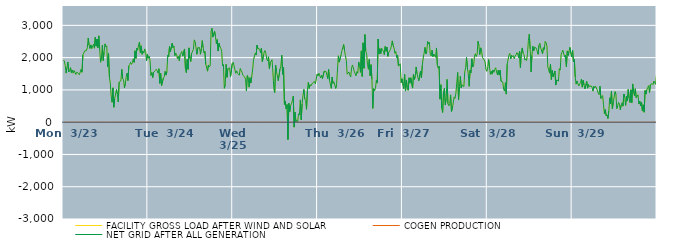
| Category | FACILITY GROSS LOAD AFTER WIND AND SOLAR | COGEN PRODUCTION | NET GRID AFTER ALL GENERATION |
|---|---|---|---|
|  Mon  3/23 | 1926 | 0 | 1926 |
|  Mon  3/23 | 1894 | 0 | 1894 |
|  Mon  3/23 | 1758 | 0 | 1758 |
|  Mon  3/23 | 1520 | 0 | 1520 |
|  Mon  3/23 | 1694 | 0 | 1694 |
|  Mon  3/23 | 1864 | 0 | 1864 |
|  Mon  3/23 | 1554 | 0 | 1554 |
|  Mon  3/23 | 1595 | 0 | 1595 |
|  Mon  3/23 | 1689 | 0 | 1689 |
|  Mon  3/23 | 1537 | 0 | 1537 |
|  Mon  3/23 | 1616 | 0 | 1616 |
|  Mon  3/23 | 1517 | 0 | 1517 |
|  Mon  3/23 | 1602 | 0 | 1602 |
|  Mon  3/23 | 1546 | 0 | 1546 |
|  Mon  3/23 | 1478 | 0 | 1478 |
|  Mon  3/23 | 1548 | 0 | 1548 |
|  Mon  3/23 | 1570 | 0 | 1570 |
|  Mon  3/23 | 1511 | 0 | 1511 |
|  Mon  3/23 | 1467 | 0 | 1467 |
|  Mon  3/23 | 1456 | 0 | 1456 |
|  Mon  3/23 | 1640 | 0 | 1640 |
|  Mon  3/23 | 1547 | 0 | 1547 |
|  Mon  3/23 | 2085 | 0 | 2085 |
|  Mon  3/23 | 2141 | 0 | 2141 |
|  Mon  3/23 | 2209 | 0 | 2209 |
|  Mon  3/23 | 2197 | 0 | 2197 |
|  Mon  3/23 | 2219 | 0 | 2219 |
|  Mon  3/23 | 2303 | 0 | 2303 |
|  Mon  3/23 | 2605 | 0 | 2605 |
|  Mon  3/23 | 2391 | 0 | 2391 |
|  Mon  3/23 | 2285 | 0 | 2285 |
|  Mon  3/23 | 2394 | 0 | 2394 |
|  Mon  3/23 | 2282 | 0 | 2282 |
|  Mon  3/23 | 2275 | 0 | 2275 |
|  Mon  3/23 | 2415 | 0 | 2415 |
|  Mon  3/23 | 2292 | 0 | 2292 |
|  Mon  3/23 | 2630 | 0 | 2630 |
|  Mon  3/23 | 2355 | 0 | 2355 |
|  Mon  3/23 | 2577 | 0 | 2577 |
|  Mon  3/23 | 2306 | 0 | 2306 |
|  Mon  3/23 | 2674 | 0 | 2674 |
|  Mon  3/23 | 2248 | 0 | 2248 |
|  Mon  3/23 | 1858 | 0 | 1858 |
|  Mon  3/23 | 1997 | 0 | 1997 |
|  Mon  3/23 | 2381 | 0 | 2381 |
|  Mon  3/23 | 1911 | 0 | 1911 |
|  Mon  3/23 | 2185 | 0 | 2185 |
|  Mon  3/23 | 2426 | 0 | 2426 |
|  Mon  3/23 | 2334 | 0 | 2334 |
|  Mon  3/23 | 2366 | 0 | 2366 |
|  Mon  3/23 | 1715 | 0 | 1715 |
|  Mon  3/23 | 2128 | 0 | 2128 |
|  Mon  3/23 | 1397 | 0 | 1397 |
|  Mon  3/23 | 1209 | 0 | 1209 |
|  Mon  3/23 | 812 | 0 | 812 |
|  Mon  3/23 | 617 | 0 | 617 |
|  Mon  3/23 | 1064 | 0 | 1064 |
|  Mon  3/23 | 462 | 0 | 462 |
|  Mon  3/23 | 733 | 0 | 733 |
|  Mon  3/23 | 871 | 0 | 871 |
|  Mon  3/23 | 1016 | 0 | 1016 |
|  Mon  3/23 | 862 | 0 | 862 |
|  Mon  3/23 | 625 | 0 | 625 |
|  Mon  3/23 | 1240 | 0 | 1240 |
|  Mon  3/23 | 1255 | 0 | 1255 |
|  Mon  3/23 | 1280 | 0 | 1280 |
|  Mon  3/23 | 1640 | 0 | 1640 |
|  Mon  3/23 | 1347 | 0 | 1347 |
|  Mon  3/23 | 1316 | 0 | 1316 |
|  Mon  3/23 | 1067 | 0 | 1067 |
|  Mon  3/23 | 1188 | 0 | 1188 |
|  Mon  3/23 | 1402 | 0 | 1402 |
|  Mon  3/23 | 1521 | 0 | 1521 |
|  Mon  3/23 | 1289 | 0 | 1289 |
|  Mon  3/23 | 1749 | 0 | 1749 |
|  Mon  3/23 | 1790 | 0 | 1790 |
|  Mon  3/23 | 1855 | 0 | 1855 |
|  Mon  3/23 | 1791 | 0 | 1791 |
|  Mon  3/23 | 1844 | 0 | 1844 |
|  Mon  3/23 | 1961 | 0 | 1961 |
|  Mon  3/23 | 1854 | 0 | 1854 |
|  Mon  3/23 | 2213 | 0 | 2213 |
|  Mon  3/23 | 1976 | 0 | 1976 |
|  Mon  3/23 | 2293 | 0 | 2293 |
|  Mon  3/23 | 2232 | 0 | 2232 |
|  Mon  3/23 | 2400 | 0 | 2400 |
|  Mon  3/23 | 2485 | 0 | 2485 |
|  Mon  3/23 | 2157 | 0 | 2157 |
|  Mon  3/23 | 2365 | 0 | 2365 |
|  Mon  3/23 | 2103 | 0 | 2103 |
|  Mon  3/23 | 2202 | 0 | 2202 |
|  Mon  3/23 | 2140 | 0 | 2140 |
|  Mon  3/23 | 2270 | 0 | 2270 |
|  Mon  3/23 | 2191 | 0 | 2191 |
|  Mon  3/23 | 1902 | 0 | 1902 |
|  Mon  3/23 | 2113 | 0 | 2113 |
|  Tue  3/24 | 1983 | 0 | 1983 |
|  Tue  3/24 | 2049 | 0 | 2049 |
|  Tue  3/24 | 1904 | 0 | 1904 |
|  Tue  3/24 | 1450 | 0 | 1450 |
|  Tue  3/24 | 1537 | 0 | 1537 |
|  Tue  3/24 | 1384 | 0 | 1384 |
|  Tue  3/24 | 1547 | 0 | 1547 |
|  Tue  3/24 | 1558 | 0 | 1558 |
|  Tue  3/24 | 1601 | 0 | 1601 |
|  Tue  3/24 | 1641 | 0 | 1641 |
|  Tue  3/24 | 1593 | 0 | 1593 |
|  Tue  3/24 | 1521 | 0 | 1521 |
|  Tue  3/24 | 1658 | 0 | 1658 |
|  Tue  3/24 | 1202 | 0 | 1202 |
|  Tue  3/24 | 1512 | 0 | 1512 |
|  Tue  3/24 | 1131 | 0 | 1131 |
|  Tue  3/24 | 1153 | 0 | 1153 |
|  Tue  3/24 | 1360 | 0 | 1360 |
|  Tue  3/24 | 1405 | 0 | 1405 |
|  Tue  3/24 | 1576 | 0 | 1576 |
|  Tue  3/24 | 1459 | 0 | 1459 |
|  Tue  3/24 | 1564 | 0 | 1564 |
|  Tue  3/24 | 2078 | 0 | 2078 |
|  Tue  3/24 | 2019 | 0 | 2019 |
|  Tue  3/24 | 2344 | 0 | 2344 |
|  Tue  3/24 | 2187 | 0 | 2187 |
|  Tue  3/24 | 2198 | 0 | 2198 |
|  Tue  3/24 | 2444 | 0 | 2444 |
|  Tue  3/24 | 2306 | 0 | 2306 |
|  Tue  3/24 | 2363 | 0 | 2363 |
|  Tue  3/24 | 2059 | 0 | 2059 |
|  Tue  3/24 | 2145 | 0 | 2145 |
|  Tue  3/24 | 2091 | 0 | 2091 |
|  Tue  3/24 | 1969 | 0 | 1969 |
|  Tue  3/24 | 2043 | 0 | 2043 |
|  Tue  3/24 | 1905 | 0 | 1905 |
|  Tue  3/24 | 2091 | 0 | 2091 |
|  Tue  3/24 | 2108 | 0 | 2108 |
|  Tue  3/24 | 2190 | 0 | 2190 |
|  Tue  3/24 | 2046 | 0 | 2046 |
|  Tue  3/24 | 2020 | 0 | 2020 |
|  Tue  3/24 | 2269 | 0 | 2269 |
|  Tue  3/24 | 1661 | 0 | 1661 |
|  Tue  3/24 | 1533 | 0 | 1533 |
|  Tue  3/24 | 1947 | 0 | 1947 |
|  Tue  3/24 | 1635 | 0 | 1635 |
|  Tue  3/24 | 2303 | 0 | 2303 |
|  Tue  3/24 | 1984 | 0 | 1984 |
|  Tue  3/24 | 1877 | 0 | 1877 |
|  Tue  3/24 | 2133 | 0 | 2133 |
|  Tue  3/24 | 2107 | 0 | 2107 |
|  Tue  3/24 | 2254 | 0 | 2254 |
|  Tue  3/24 | 2552 | 0 | 2552 |
|  Tue  3/24 | 2497 | 0 | 2497 |
|  Tue  3/24 | 2500 | 0 | 2500 |
|  Tue  3/24 | 2103 | 0 | 2103 |
|  Tue  3/24 | 2306 | 0 | 2306 |
|  Tue  3/24 | 2335 | 0 | 2335 |
|  Tue  3/24 | 2311 | 0 | 2311 |
|  Tue  3/24 | 2106 | 0 | 2106 |
|  Tue  3/24 | 2274 | 0 | 2274 |
|  Tue  3/24 | 2528 | 0 | 2528 |
|  Tue  3/24 | 2315 | 0 | 2315 |
|  Tue  3/24 | 2142 | 0 | 2142 |
|  Tue  3/24 | 2198 | 0 | 2198 |
|  Tue  3/24 | 1800 | 0 | 1800 |
|  Tue  3/24 | 1792 | 0 | 1792 |
|  Tue  3/24 | 1581 | 0 | 1581 |
|  Tue  3/24 | 1773 | 0 | 1773 |
|  Tue  3/24 | 1712 | 0 | 1712 |
|  Tue  3/24 | 1748 | 0 | 1748 |
|  Tue  3/24 | 2812 | 0 | 2812 |
|  Tue  3/24 | 2909 | 0 | 2909 |
|  Tue  3/24 | 2637 | 0 | 2637 |
|  Tue  3/24 | 2607 | 0 | 2607 |
|  Tue  3/24 | 2814 | 0 | 2814 |
|  Tue  3/24 | 2661 | 0 | 2661 |
|  Tue  3/24 | 2428 | 0 | 2428 |
|  Tue  3/24 | 2560 | 0 | 2560 |
|  Tue  3/24 | 2205 | 0 | 2205 |
|  Tue  3/24 | 2447 | 0 | 2447 |
|  Tue  3/24 | 2333 | 0 | 2333 |
|  Tue  3/24 | 2295 | 0 | 2295 |
|  Tue  3/24 | 2197 | 0 | 2197 |
|  Tue  3/24 | 1740 | 0 | 1740 |
|  Tue  3/24 | 1786 | 0 | 1786 |
|  Tue  3/24 | 1049 | 0 | 1049 |
|  Tue  3/24 | 1154 | 0 | 1154 |
|  Tue  3/24 | 1792 | 0 | 1792 |
|  Tue  3/24 | 1389 | 0 | 1389 |
|  Tue  3/24 | 1658 | 0 | 1658 |
|  Tue  3/24 | 1678 | 0 | 1678 |
|  Tue  3/24 | 1682 | 0 | 1682 |
|  Tue  3/24 | 1411 | 0 | 1411 |
|  Tue  3/24 | 1417 | 0 | 1417 |
|  Tue  3/24 | 1816 | 0 | 1816 |
|  Wed  3/25 | 1859 | 0 | 1859 |
|  Wed  3/25 | 1746 | 0 | 1746 |
|  Wed  3/25 | 1622 | 0 | 1622 |
|  Wed  3/25 | 1515 | 0 | 1515 |
|  Wed  3/25 | 1591 | 0 | 1591 |
|  Wed  3/25 | 1509 | 0 | 1509 |
|  Wed  3/25 | 1496 | 0 | 1496 |
|  Wed  3/25 | 1457 | 0 | 1457 |
|  Wed  3/25 | 1667 | 0 | 1667 |
|  Wed  3/25 | 1605 | 0 | 1605 |
|  Wed  3/25 | 1554 | 0 | 1554 |
|  Wed  3/25 | 1452 | 0 | 1452 |
|  Wed  3/25 | 1454 | 0 | 1454 |
|  Wed  3/25 | 1403 | 0 | 1403 |
|  Wed  3/25 | 1333 | 0 | 1333 |
|  Wed  3/25 | 973 | 0 | 973 |
|  Wed  3/25 | 1446 | 0 | 1446 |
|  Wed  3/25 | 1394 | 0 | 1394 |
|  Wed  3/25 | 1085 | 0 | 1085 |
|  Wed  3/25 | 1378 | 0 | 1378 |
|  Wed  3/25 | 1212 | 0 | 1212 |
|  Wed  3/25 | 1412 | 0 | 1412 |
|  Wed  3/25 | 1618 | 0 | 1618 |
|  Wed  3/25 | 1925 | 0 | 1925 |
|  Wed  3/25 | 1928 | 0 | 1928 |
|  Wed  3/25 | 2142 | 0 | 2142 |
|  Wed  3/25 | 2079 | 0 | 2079 |
|  Wed  3/25 | 2390 | 0 | 2390 |
|  Wed  3/25 | 2282 | 0 | 2282 |
|  Wed  3/25 | 2289 | 0 | 2289 |
|  Wed  3/25 | 2264 | 0 | 2264 |
|  Wed  3/25 | 2155 | 0 | 2155 |
|  Wed  3/25 | 2290 | 0 | 2290 |
|  Wed  3/25 | 1878 | 0 | 1878 |
|  Wed  3/25 | 1998 | 0 | 1998 |
|  Wed  3/25 | 2167 | 0 | 2167 |
|  Wed  3/25 | 2221 | 0 | 2221 |
|  Wed  3/25 | 2135 | 0 | 2135 |
|  Wed  3/25 | 1950 | 0 | 1950 |
|  Wed  3/25 | 1899 | 0 | 1899 |
|  Wed  3/25 | 2027 | 0 | 2027 |
|  Wed  3/25 | 1661 | 0 | 1661 |
|  Wed  3/25 | 1851 | 0 | 1851 |
|  Wed  3/25 | 1873 | 0 | 1873 |
|  Wed  3/25 | 1935 | 0 | 1935 |
|  Wed  3/25 | 1534 | 0 | 1534 |
|  Wed  3/25 | 1056 | 0 | 1056 |
|  Wed  3/25 | 916 | 0 | 916 |
|  Wed  3/25 | 1770 | 0 | 1770 |
|  Wed  3/25 | 1571 | 0 | 1571 |
|  Wed  3/25 | 1559 | 0 | 1559 |
|  Wed  3/25 | 1284 | 0 | 1284 |
|  Wed  3/25 | 1256 | 0 | 1256 |
|  Wed  3/25 | 1649 | 0 | 1649 |
|  Wed  3/25 | 1734 | 0 | 1734 |
|  Wed  3/25 | 2079 | 0 | 2079 |
|  Wed  3/25 | 1484 | 0 | 1484 |
|  Wed  3/25 | 1695 | 0 | 1695 |
|  Wed  3/25 | 550 | 0 | 550 |
|  Wed  3/25 | 658 | 0 | 658 |
|  Wed  3/25 | 408 | 0 | 408 |
|  Wed  3/25 | 545 | 0 | 545 |
|  Wed  3/25 | -540 | 0 | -540 |
|  Wed  3/25 | 589 | 0 | 589 |
|  Wed  3/25 | 324 | 0 | 324 |
|  Wed  3/25 | 513 | 0 | 513 |
|  Wed  3/25 | 577 | 0 | 577 |
|  Wed  3/25 | 670 | 0 | 670 |
|  Wed  3/25 | 808 | 0 | 808 |
|  Wed  3/25 | -154 | 0 | -154 |
|  Wed  3/25 | 308 | 0 | 308 |
|  Wed  3/25 | 18 | 0 | 18 |
|  Wed  3/25 | 58 | 0 | 58 |
|  Wed  3/25 | 21 | 0 | 21 |
|  Wed  3/25 | 260 | 0 | 260 |
|  Wed  3/25 | 225 | 0 | 225 |
|  Wed  3/25 | 691 | 0 | 691 |
|  Wed  3/25 | 74 | 0 | 74 |
|  Wed  3/25 | 565 | 0 | 565 |
|  Wed  3/25 | 830 | 0 | 830 |
|  Wed  3/25 | 1014 | 0 | 1014 |
|  Wed  3/25 | 718 | 0 | 718 |
|  Wed  3/25 | 676 | 0 | 676 |
|  Wed  3/25 | 399 | 0 | 399 |
|  Wed  3/25 | 968 | 0 | 968 |
|  Wed  3/25 | 1234 | 0 | 1234 |
|  Wed  3/25 | 1045 | 0 | 1045 |
|  Wed  3/25 | 1161 | 0 | 1161 |
|  Wed  3/25 | 1126 | 0 | 1126 |
|  Wed  3/25 | 1181 | 0 | 1181 |
|  Wed  3/25 | 1220 | 0 | 1220 |
|  Wed  3/25 | 1199 | 0 | 1199 |
|  Wed  3/25 | 1260 | 0 | 1260 |
|  Wed  3/25 | 1188 | 0 | 1188 |
|  Wed  3/25 | 1173 | 0 | 1173 |
|  Wed  3/25 | 1494 | 0 | 1494 |
|  Thu  3/26 | 1430 | 0 | 1430 |
|  Thu  3/26 | 1518 | 0 | 1518 |
|  Thu  3/26 | 1511 | 0 | 1511 |
|  Thu  3/26 | 1369 | 0 | 1369 |
|  Thu  3/26 | 1455 | 0 | 1455 |
|  Thu  3/26 | 1348 | 0 | 1348 |
|  Thu  3/26 | 1365 | 0 | 1365 |
|  Thu  3/26 | 1580 | 0 | 1580 |
|  Thu  3/26 | 1592 | 0 | 1592 |
|  Thu  3/26 | 1571 | 0 | 1571 |
|  Thu  3/26 | 1585 | 0 | 1585 |
|  Thu  3/26 | 1349 | 0 | 1349 |
|  Thu  3/26 | 1634 | 0 | 1634 |
|  Thu  3/26 | 1294 | 0 | 1294 |
|  Thu  3/26 | 1319 | 0 | 1319 |
|  Thu  3/26 | 1049 | 0 | 1049 |
|  Thu  3/26 | 1399 | 0 | 1399 |
|  Thu  3/26 | 1202 | 0 | 1202 |
|  Thu  3/26 | 1250 | 0 | 1250 |
|  Thu  3/26 | 1246 | 0 | 1246 |
|  Thu  3/26 | 1048 | 0 | 1048 |
|  Thu  3/26 | 1163 | 0 | 1163 |
|  Thu  3/26 | 1617 | 0 | 1617 |
|  Thu  3/26 | 2056 | 0 | 2056 |
|  Thu  3/26 | 1860 | 0 | 1860 |
|  Thu  3/26 | 1886 | 0 | 1886 |
|  Thu  3/26 | 2076 | 0 | 2076 |
|  Thu  3/26 | 2214 | 0 | 2214 |
|  Thu  3/26 | 2244 | 0 | 2244 |
|  Thu  3/26 | 2406 | 0 | 2406 |
|  Thu  3/26 | 2218 | 0 | 2218 |
|  Thu  3/26 | 2064 | 0 | 2064 |
|  Thu  3/26 | 1915 | 0 | 1915 |
|  Thu  3/26 | 1488 | 0 | 1488 |
|  Thu  3/26 | 1483 | 0 | 1483 |
|  Thu  3/26 | 1555 | 0 | 1555 |
|  Thu  3/26 | 1460 | 0 | 1460 |
|  Thu  3/26 | 1401 | 0 | 1401 |
|  Thu  3/26 | 1691 | 0 | 1691 |
|  Thu  3/26 | 1773 | 0 | 1773 |
|  Thu  3/26 | 1769 | 0 | 1769 |
|  Thu  3/26 | 1578 | 0 | 1578 |
|  Thu  3/26 | 1604 | 0 | 1604 |
|  Thu  3/26 | 1436 | 0 | 1436 |
|  Thu  3/26 | 1569 | 0 | 1569 |
|  Thu  3/26 | 1517 | 0 | 1517 |
|  Thu  3/26 | 1866 | 0 | 1866 |
|  Thu  3/26 | 1751 | 0 | 1751 |
|  Thu  3/26 | 1545 | 0 | 1545 |
|  Thu  3/26 | 2210 | 0 | 2210 |
|  Thu  3/26 | 1417 | 0 | 1417 |
|  Thu  3/26 | 2459 | 0 | 2459 |
|  Thu  3/26 | 1669 | 0 | 1669 |
|  Thu  3/26 | 2716 | 0 | 2716 |
|  Thu  3/26 | 2204 | 0 | 2204 |
|  Thu  3/26 | 2107 | 0 | 2107 |
|  Thu  3/26 | 1784 | 0 | 1784 |
|  Thu  3/26 | 1640 | 0 | 1640 |
|  Thu  3/26 | 1945 | 0 | 1945 |
|  Thu  3/26 | 1439 | 0 | 1439 |
|  Thu  3/26 | 1782 | 0 | 1782 |
|  Thu  3/26 | 1324 | 0 | 1324 |
|  Thu  3/26 | 427 | 0 | 427 |
|  Thu  3/26 | 1039 | 0 | 1039 |
|  Thu  3/26 | 983 | 0 | 983 |
|  Thu  3/26 | 1045 | 0 | 1045 |
|  Thu  3/26 | 1308 | 0 | 1308 |
|  Thu  3/26 | 1211 | 0 | 1211 |
|  Thu  3/26 | 2577 | 0 | 2577 |
|  Thu  3/26 | 2112 | 0 | 2112 |
|  Thu  3/26 | 2279 | 0 | 2279 |
|  Thu  3/26 | 2124 | 0 | 2124 |
|  Thu  3/26 | 2285 | 0 | 2285 |
|  Thu  3/26 | 2238 | 0 | 2238 |
|  Thu  3/26 | 2202 | 0 | 2202 |
|  Thu  3/26 | 2091 | 0 | 2091 |
|  Thu  3/26 | 2346 | 0 | 2346 |
|  Thu  3/26 | 2197 | 0 | 2197 |
|  Thu  3/26 | 2325 | 0 | 2325 |
|  Thu  3/26 | 2040 | 0 | 2040 |
|  Thu  3/26 | 2167 | 0 | 2167 |
|  Thu  3/26 | 2195 | 0 | 2195 |
|  Thu  3/26 | 2249 | 0 | 2249 |
|  Thu  3/26 | 2367 | 0 | 2367 |
|  Thu  3/26 | 2520 | 0 | 2520 |
|  Thu  3/26 | 2374 | 0 | 2374 |
|  Thu  3/26 | 2297 | 0 | 2297 |
|  Thu  3/26 | 2133 | 0 | 2133 |
|  Thu  3/26 | 2191 | 0 | 2191 |
|  Thu  3/26 | 2006 | 0 | 2006 |
|  Thu  3/26 | 2079 | 0 | 2079 |
|  Thu  3/26 | 1738 | 0 | 1738 |
|  Thu  3/26 | 1733 | 0 | 1733 |
|  Thu  3/26 | 1810 | 0 | 1810 |
|  Thu  3/26 | 1224 | 0 | 1224 |
|  Thu  3/26 | 1345 | 0 | 1345 |
|  Fri  3/27 | 1323 | 0 | 1323 |
|  Fri  3/27 | 1045 | 0 | 1045 |
|  Fri  3/27 | 1479 | 0 | 1479 |
|  Fri  3/27 | 964 | 0 | 964 |
|  Fri  3/27 | 1308 | 0 | 1308 |
|  Fri  3/27 | 1066 | 0 | 1066 |
|  Fri  3/27 | 989 | 0 | 989 |
|  Fri  3/27 | 1375 | 0 | 1375 |
|  Fri  3/27 | 1209 | 0 | 1209 |
|  Fri  3/27 | 1376 | 0 | 1376 |
|  Fri  3/27 | 1394 | 0 | 1394 |
|  Fri  3/27 | 1056 | 0 | 1056 |
|  Fri  3/27 | 1489 | 0 | 1489 |
|  Fri  3/27 | 1325 | 0 | 1325 |
|  Fri  3/27 | 1408 | 0 | 1408 |
|  Fri  3/27 | 1712 | 0 | 1712 |
|  Fri  3/27 | 1501 | 0 | 1501 |
|  Fri  3/27 | 1502 | 0 | 1502 |
|  Fri  3/27 | 1283 | 0 | 1283 |
|  Fri  3/27 | 1303 | 0 | 1303 |
|  Fri  3/27 | 1583 | 0 | 1583 |
|  Fri  3/27 | 1371 | 0 | 1371 |
|  Fri  3/27 | 1763 | 0 | 1763 |
|  Fri  3/27 | 1990 | 0 | 1990 |
|  Fri  3/27 | 2136 | 0 | 2136 |
|  Fri  3/27 | 2318 | 0 | 2318 |
|  Fri  3/27 | 2117 | 0 | 2117 |
|  Fri  3/27 | 2194 | 0 | 2194 |
|  Fri  3/27 | 2500 | 0 | 2500 |
|  Fri  3/27 | 2420 | 0 | 2420 |
|  Fri  3/27 | 2475 | 0 | 2475 |
|  Fri  3/27 | 2102 | 0 | 2102 |
|  Fri  3/27 | 2052 | 0 | 2052 |
|  Fri  3/27 | 2231 | 0 | 2231 |
|  Fri  3/27 | 2033 | 0 | 2033 |
|  Fri  3/27 | 2111 | 0 | 2111 |
|  Fri  3/27 | 2083 | 0 | 2083 |
|  Fri  3/27 | 2011 | 0 | 2011 |
|  Fri  3/27 | 2300 | 0 | 2300 |
|  Fri  3/27 | 1763 | 0 | 1763 |
|  Fri  3/27 | 1668 | 0 | 1668 |
|  Fri  3/27 | 1737 | 0 | 1737 |
|  Fri  3/27 | 713 | 0 | 713 |
|  Fri  3/27 | 1159 | 0 | 1159 |
|  Fri  3/27 | 429 | 0 | 429 |
|  Fri  3/27 | 300 | 0 | 300 |
|  Fri  3/27 | 936 | 0 | 936 |
|  Fri  3/27 | 1053 | 0 | 1053 |
|  Fri  3/27 | 535 | 0 | 535 |
|  Fri  3/27 | 732 | 0 | 732 |
|  Fri  3/27 | 1325 | 0 | 1325 |
|  Fri  3/27 | 572 | 0 | 572 |
|  Fri  3/27 | 508 | 0 | 508 |
|  Fri  3/27 | 572 | 0 | 572 |
|  Fri  3/27 | 846 | 0 | 846 |
|  Fri  3/27 | 331 | 0 | 331 |
|  Fri  3/27 | 423 | 0 | 423 |
|  Fri  3/27 | 395 | 0 | 395 |
|  Fri  3/27 | 783 | 0 | 783 |
|  Fri  3/27 | 737 | 0 | 737 |
|  Fri  3/27 | 903 | 0 | 903 |
|  Fri  3/27 | 1214 | 0 | 1214 |
|  Fri  3/27 | 1541 | 0 | 1541 |
|  Fri  3/27 | 686 | 0 | 686 |
|  Fri  3/27 | 1104 | 0 | 1104 |
|  Fri  3/27 | 1421 | 0 | 1421 |
|  Fri  3/27 | 1062 | 0 | 1062 |
|  Fri  3/27 | 1155 | 0 | 1155 |
|  Fri  3/27 | 1176 | 0 | 1176 |
|  Fri  3/27 | 1102 | 0 | 1102 |
|  Fri  3/27 | 1556 | 0 | 1556 |
|  Fri  3/27 | 1686 | 0 | 1686 |
|  Fri  3/27 | 2005 | 0 | 2005 |
|  Fri  3/27 | 1690 | 0 | 1690 |
|  Fri  3/27 | 1497 | 0 | 1497 |
|  Fri  3/27 | 1112 | 0 | 1112 |
|  Fri  3/27 | 1608 | 0 | 1608 |
|  Fri  3/27 | 1529 | 0 | 1529 |
|  Fri  3/27 | 1964 | 0 | 1964 |
|  Fri  3/27 | 1707 | 0 | 1707 |
|  Fri  3/27 | 1741 | 0 | 1741 |
|  Fri  3/27 | 2045 | 0 | 2045 |
|  Fri  3/27 | 2121 | 0 | 2121 |
|  Fri  3/27 | 2033 | 0 | 2033 |
|  Fri  3/27 | 2101 | 0 | 2101 |
|  Fri  3/27 | 2507 | 0 | 2507 |
|  Fri  3/27 | 2381 | 0 | 2381 |
|  Fri  3/27 | 2095 | 0 | 2095 |
|  Fri  3/27 | 2303 | 0 | 2303 |
|  Fri  3/27 | 2221 | 0 | 2221 |
|  Fri  3/27 | 2009 | 0 | 2009 |
|  Fri  3/27 | 2014 | 0 | 2014 |
|  Fri  3/27 | 1931 | 0 | 1931 |
|  Fri  3/27 | 1867 | 0 | 1867 |
|  Fri  3/27 | 1634 | 0 | 1634 |
|  Fri  3/27 | 1577 | 0 | 1577 |
|  Sat  3/28 | 1680 | 0 | 1680 |
|  Sat  3/28 | 1939 | 0 | 1939 |
|  Sat  3/28 | 1718 | 0 | 1718 |
|  Sat  3/28 | 1482 | 0 | 1482 |
|  Sat  3/28 | 1577 | 0 | 1577 |
|  Sat  3/28 | 1487 | 0 | 1487 |
|  Sat  3/28 | 1617 | 0 | 1617 |
|  Sat  3/28 | 1541 | 0 | 1541 |
|  Sat  3/28 | 1638 | 0 | 1638 |
|  Sat  3/28 | 1687 | 0 | 1687 |
|  Sat  3/28 | 1557 | 0 | 1557 |
|  Sat  3/28 | 1467 | 0 | 1467 |
|  Sat  3/28 | 1614 | 0 | 1614 |
|  Sat  3/28 | 1458 | 0 | 1458 |
|  Sat  3/28 | 1611 | 0 | 1611 |
|  Sat  3/28 | 1271 | 0 | 1271 |
|  Sat  3/28 | 1254 | 0 | 1254 |
|  Sat  3/28 | 1245 | 0 | 1245 |
|  Sat  3/28 | 1026 | 0 | 1026 |
|  Sat  3/28 | 965 | 0 | 965 |
|  Sat  3/28 | 1226 | 0 | 1226 |
|  Sat  3/28 | 870 | 0 | 870 |
|  Sat  3/28 | 1797 | 0 | 1797 |
|  Sat  3/28 | 1787 | 0 | 1787 |
|  Sat  3/28 | 2079 | 0 | 2079 |
|  Sat  3/28 | 2132 | 0 | 2132 |
|  Sat  3/28 | 1964 | 0 | 1964 |
|  Sat  3/28 | 2072 | 0 | 2072 |
|  Sat  3/28 | 2026 | 0 | 2026 |
|  Sat  3/28 | 2066 | 0 | 2066 |
|  Sat  3/28 | 1968 | 0 | 1968 |
|  Sat  3/28 | 2047 | 0 | 2047 |
|  Sat  3/28 | 2085 | 0 | 2085 |
|  Sat  3/28 | 2156 | 0 | 2156 |
|  Sat  3/28 | 2109 | 0 | 2109 |
|  Sat  3/28 | 2002 | 0 | 2002 |
|  Sat  3/28 | 2204 | 0 | 2204 |
|  Sat  3/28 | 1679 | 0 | 1679 |
|  Sat  3/28 | 2177 | 0 | 2177 |
|  Sat  3/28 | 2301 | 0 | 2301 |
|  Sat  3/28 | 2136 | 0 | 2136 |
|  Sat  3/28 | 2096 | 0 | 2096 |
|  Sat  3/28 | 1923 | 0 | 1923 |
|  Sat  3/28 | 1962 | 0 | 1962 |
|  Sat  3/28 | 1910 | 0 | 1910 |
|  Sat  3/28 | 2124 | 0 | 2124 |
|  Sat  3/28 | 2529 | 0 | 2529 |
|  Sat  3/28 | 2726 | 0 | 2726 |
|  Sat  3/28 | 2272 | 0 | 2272 |
|  Sat  3/28 | 1558 | 0 | 1558 |
|  Sat  3/28 | 2072 | 0 | 2072 |
|  Sat  3/28 | 2356 | 0 | 2356 |
|  Sat  3/28 | 2209 | 0 | 2209 |
|  Sat  3/28 | 2323 | 0 | 2323 |
|  Sat  3/28 | 2300 | 0 | 2300 |
|  Sat  3/28 | 2291 | 0 | 2291 |
|  Sat  3/28 | 2311 | 0 | 2311 |
|  Sat  3/28 | 2103 | 0 | 2103 |
|  Sat  3/28 | 2380 | 0 | 2380 |
|  Sat  3/28 | 2447 | 0 | 2447 |
|  Sat  3/28 | 2294 | 0 | 2294 |
|  Sat  3/28 | 2321 | 0 | 2321 |
|  Sat  3/28 | 2120 | 0 | 2120 |
|  Sat  3/28 | 2308 | 0 | 2308 |
|  Sat  3/28 | 2251 | 0 | 2251 |
|  Sat  3/28 | 2506 | 0 | 2506 |
|  Sat  3/28 | 2462 | 0 | 2462 |
|  Sat  3/28 | 2363 | 0 | 2363 |
|  Sat  3/28 | 1712 | 0 | 1712 |
|  Sat  3/28 | 1618 | 0 | 1618 |
|  Sat  3/28 | 1519 | 0 | 1519 |
|  Sat  3/28 | 1794 | 0 | 1794 |
|  Sat  3/28 | 1321 | 0 | 1321 |
|  Sat  3/28 | 1602 | 0 | 1602 |
|  Sat  3/28 | 1405 | 0 | 1405 |
|  Sat  3/28 | 1400 | 0 | 1400 |
|  Sat  3/28 | 1584 | 0 | 1584 |
|  Sat  3/28 | 1151 | 0 | 1151 |
|  Sat  3/28 | 1311 | 0 | 1311 |
|  Sat  3/28 | 1334 | 0 | 1334 |
|  Sat  3/28 | 1272 | 0 | 1272 |
|  Sat  3/28 | 1660 | 0 | 1660 |
|  Sat  3/28 | 1612 | 0 | 1612 |
|  Sat  3/28 | 2100 | 0 | 2100 |
|  Sat  3/28 | 2169 | 0 | 2169 |
|  Sat  3/28 | 2232 | 0 | 2232 |
|  Sat  3/28 | 2246 | 0 | 2246 |
|  Sat  3/28 | 2017 | 0 | 2017 |
|  Sat  3/28 | 2075 | 0 | 2075 |
|  Sat  3/28 | 1721 | 0 | 1721 |
|  Sat  3/28 | 2209 | 0 | 2209 |
|  Sat  3/28 | 2068 | 0 | 2068 |
|  Sat  3/28 | 2202 | 0 | 2202 |
|  Sat  3/28 | 2318 | 0 | 2318 |
|  Sat  3/28 | 2127 | 0 | 2127 |
|  Sat  3/28 | 2019 | 0 | 2019 |
|  Sun  3/29 | 2236 | 0 | 2236 |
|  Sun  3/29 | 1869 | 0 | 1869 |
|  Sun  3/29 | 1940 | 0 | 1940 |
|  Sun  3/29 | 1390 | 0 | 1390 |
|  Sun  3/29 | 1180 | 0 | 1180 |
|  Sun  3/29 | 1278 | 0 | 1278 |
|  Sun  3/29 | 1303 | 0 | 1303 |
|  Sun  3/29 | 1121 | 0 | 1121 |
|  Sun  3/29 | 1186 | 0 | 1186 |
|  Sun  3/29 | 1226 | 0 | 1226 |
|  Sun  3/29 | 1338 | 0 | 1338 |
|  Sun  3/29 | 1086 | 0 | 1086 |
|  Sun  3/29 | 1299 | 0 | 1299 |
|  Sun  3/29 | 1148 | 0 | 1148 |
|  Sun  3/29 | 1029 | 0 | 1029 |
|  Sun  3/29 | 1018 | 0 | 1018 |
|  Sun  3/29 | 1261 | 0 | 1261 |
|  Sun  3/29 | 1054 | 0 | 1054 |
|  Sun  3/29 | 1166 | 0 | 1166 |
|  Sun  3/29 | 1104 | 0 | 1104 |
|  Sun  3/29 | 1094 | 0 | 1094 |
|  Sun  3/29 | 1126 | 0 | 1126 |
|  Sun  3/29 | 1085 | 0 | 1085 |
|  Sun  3/29 | 963 | 0 | 963 |
|  Sun  3/29 | 1113 | 0 | 1113 |
|  Sun  3/29 | 1056 | 0 | 1056 |
|  Sun  3/29 | 1113 | 0 | 1113 |
|  Sun  3/29 | 1063 | 0 | 1063 |
|  Sun  3/29 | 1065 | 0 | 1065 |
|  Sun  3/29 | 905 | 0 | 905 |
|  Sun  3/29 | 851 | 0 | 851 |
|  Sun  3/29 | 1117 | 0 | 1117 |
|  Sun  3/29 | 733 | 0 | 733 |
|  Sun  3/29 | 710 | 0 | 710 |
|  Sun  3/29 | 826 | 0 | 826 |
|  Sun  3/29 | 536 | 0 | 536 |
|  Sun  3/29 | 267 | 0 | 267 |
|  Sun  3/29 | 393 | 0 | 393 |
|  Sun  3/29 | 194 | 0 | 194 |
|  Sun  3/29 | 228 | 0 | 228 |
|  Sun  3/29 | 112 | 0 | 112 |
|  Sun  3/29 | 345 | 0 | 345 |
|  Sun  3/29 | 754 | 0 | 754 |
|  Sun  3/29 | 574 | 0 | 574 |
|  Sun  3/29 | 963 | 0 | 963 |
|  Sun  3/29 | 412 | 0 | 412 |
|  Sun  3/29 | 611 | 0 | 611 |
|  Sun  3/29 | 606 | 0 | 606 |
|  Sun  3/29 | 946 | 0 | 946 |
|  Sun  3/29 | 867 | 0 | 867 |
|  Sun  3/29 | 422 | 0 | 422 |
|  Sun  3/29 | 515 | 0 | 515 |
|  Sun  3/29 | 611 | 0 | 611 |
|  Sun  3/29 | 559 | 0 | 559 |
|  Sun  3/29 | 383 | 0 | 383 |
|  Sun  3/29 | 532 | 0 | 532 |
|  Sun  3/29 | 602 | 0 | 602 |
|  Sun  3/29 | 496 | 0 | 496 |
|  Sun  3/29 | 872 | 0 | 872 |
|  Sun  3/29 | 778 | 0 | 778 |
|  Sun  3/29 | 520 | 0 | 520 |
|  Sun  3/29 | 801 | 0 | 801 |
|  Sun  3/29 | 666 | 0 | 666 |
|  Sun  3/29 | 1013 | 0 | 1013 |
|  Sun  3/29 | 748 | 0 | 748 |
|  Sun  3/29 | 608 | 0 | 608 |
|  Sun  3/29 | 1004 | 0 | 1004 |
|  Sun  3/29 | 604 | 0 | 604 |
|  Sun  3/29 | 1186 | 0 | 1186 |
|  Sun  3/29 | 924 | 0 | 924 |
|  Sun  3/29 | 821 | 0 | 821 |
|  Sun  3/29 | 1035 | 0 | 1035 |
|  Sun  3/29 | 754 | 0 | 754 |
|  Sun  3/29 | 777 | 0 | 777 |
|  Sun  3/29 | 849 | 0 | 849 |
|  Sun  3/29 | 564 | 0 | 564 |
|  Sun  3/29 | 654 | 0 | 654 |
|  Sun  3/29 | 506 | 0 | 506 |
|  Sun  3/29 | 625 | 0 | 625 |
|  Sun  3/29 | 345 | 0 | 345 |
|  Sun  3/29 | 538 | 0 | 538 |
|  Sun  3/29 | 308 | 0 | 308 |
|  Sun  3/29 | 981 | 0 | 981 |
|  Sun  3/29 | 869 | 0 | 869 |
|  Sun  3/29 | 1004 | 0 | 1004 |
|  Sun  3/29 | 1073 | 0 | 1073 |
|  Sun  3/29 | 1132 | 0 | 1132 |
|  Sun  3/29 | 919 | 0 | 919 |
|  Sun  3/29 | 1159 | 0 | 1159 |
|  Sun  3/29 | 1130 | 0 | 1130 |
|  Sun  3/29 | 1198 | 0 | 1198 |
|  Sun  3/29 | 1164 | 0 | 1164 |
|  Sun  3/29 | 1276 | 0 | 1276 |
|  Sun  3/29 | 1288 | 0 | 1288 |
|  Sun  3/29 | 1174 | 0 | 1174 |
|  Sun  3/29 | 1492 | 0 | 1492 |